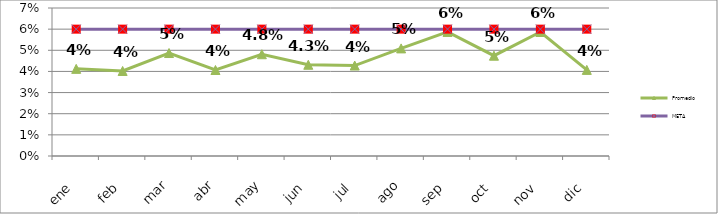
| Category | Promedio | META  |
|---|---|---|
| ene | 0.041 | 0.06 |
| feb | 0.04 | 0.06 |
| mar | 0.049 | 0.06 |
| abr | 0.041 | 0.06 |
| may | 0.048 | 0.06 |
| jun | 0.043 | 0.06 |
| jul | 0.043 | 0.06 |
| ago | 0.051 | 0.06 |
| sep | 0.059 | 0.06 |
| oct | 0.047 | 0.06 |
| nov | 0.059 | 0.06 |
| dic | 0.041 | 0.06 |